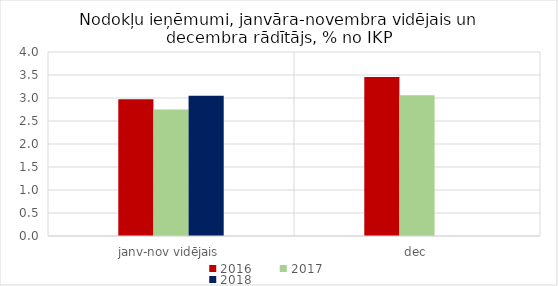
| Category | 2016 | 2017 | 2018 |
|---|---|---|---|
| janv-nov vidējais | 2.974 | 2.751 | 3.047 |
| dec | 3.458 | 3.057 | 0 |